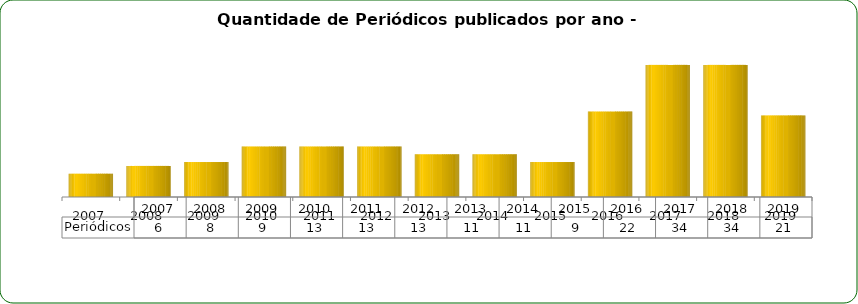
| Category | Periódicos |
|---|---|
| 2007.0 | 6 |
| 2008.0 | 8 |
| 2009.0 | 9 |
| 2010.0 | 13 |
| 2011.0 | 13 |
| 2012.0 | 13 |
| 2013.0 | 11 |
| 2014.0 | 11 |
| 2015.0 | 9 |
| 2016.0 | 22 |
| 2017.0 | 34 |
| 2018.0 | 34 |
| 2019.0 | 21 |